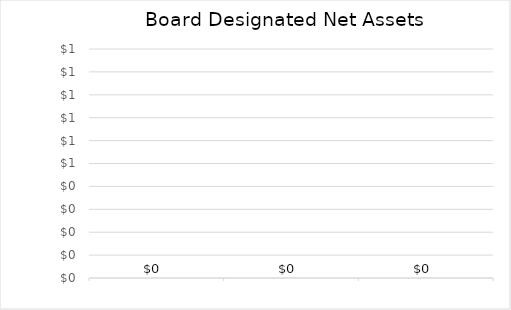
| Category | Series 0 |
|---|---|
| 0 | 0 |
| 1900-01-01 | 0 |
| 1900-01-02 | 0 |